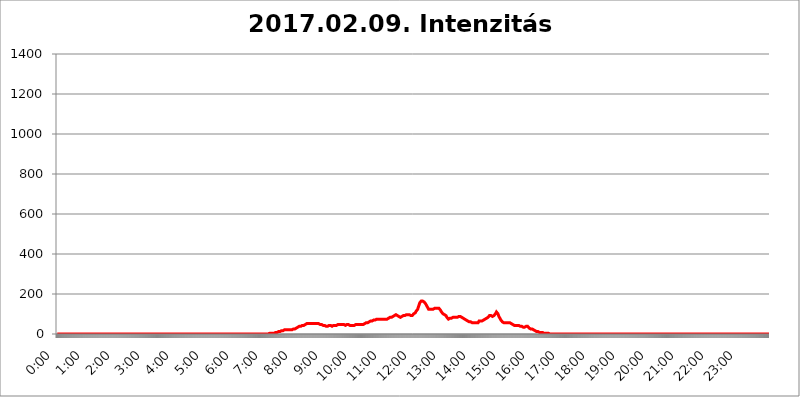
| Category | 2017.02.09. Intenzitás [W/m^2] |
|---|---|
| 0.0 | 0 |
| 0.0006944444444444445 | 0 |
| 0.001388888888888889 | 0 |
| 0.0020833333333333333 | 0 |
| 0.002777777777777778 | 0 |
| 0.003472222222222222 | 0 |
| 0.004166666666666667 | 0 |
| 0.004861111111111111 | 0 |
| 0.005555555555555556 | 0 |
| 0.0062499999999999995 | 0 |
| 0.006944444444444444 | 0 |
| 0.007638888888888889 | 0 |
| 0.008333333333333333 | 0 |
| 0.009027777777777779 | 0 |
| 0.009722222222222222 | 0 |
| 0.010416666666666666 | 0 |
| 0.011111111111111112 | 0 |
| 0.011805555555555555 | 0 |
| 0.012499999999999999 | 0 |
| 0.013194444444444444 | 0 |
| 0.013888888888888888 | 0 |
| 0.014583333333333332 | 0 |
| 0.015277777777777777 | 0 |
| 0.015972222222222224 | 0 |
| 0.016666666666666666 | 0 |
| 0.017361111111111112 | 0 |
| 0.018055555555555557 | 0 |
| 0.01875 | 0 |
| 0.019444444444444445 | 0 |
| 0.02013888888888889 | 0 |
| 0.020833333333333332 | 0 |
| 0.02152777777777778 | 0 |
| 0.022222222222222223 | 0 |
| 0.02291666666666667 | 0 |
| 0.02361111111111111 | 0 |
| 0.024305555555555556 | 0 |
| 0.024999999999999998 | 0 |
| 0.025694444444444447 | 0 |
| 0.02638888888888889 | 0 |
| 0.027083333333333334 | 0 |
| 0.027777777777777776 | 0 |
| 0.02847222222222222 | 0 |
| 0.029166666666666664 | 0 |
| 0.029861111111111113 | 0 |
| 0.030555555555555555 | 0 |
| 0.03125 | 0 |
| 0.03194444444444445 | 0 |
| 0.03263888888888889 | 0 |
| 0.03333333333333333 | 0 |
| 0.034027777777777775 | 0 |
| 0.034722222222222224 | 0 |
| 0.035416666666666666 | 0 |
| 0.036111111111111115 | 0 |
| 0.03680555555555556 | 0 |
| 0.0375 | 0 |
| 0.03819444444444444 | 0 |
| 0.03888888888888889 | 0 |
| 0.03958333333333333 | 0 |
| 0.04027777777777778 | 0 |
| 0.04097222222222222 | 0 |
| 0.041666666666666664 | 0 |
| 0.042361111111111106 | 0 |
| 0.04305555555555556 | 0 |
| 0.043750000000000004 | 0 |
| 0.044444444444444446 | 0 |
| 0.04513888888888889 | 0 |
| 0.04583333333333334 | 0 |
| 0.04652777777777778 | 0 |
| 0.04722222222222222 | 0 |
| 0.04791666666666666 | 0 |
| 0.04861111111111111 | 0 |
| 0.049305555555555554 | 0 |
| 0.049999999999999996 | 0 |
| 0.05069444444444445 | 0 |
| 0.051388888888888894 | 0 |
| 0.052083333333333336 | 0 |
| 0.05277777777777778 | 0 |
| 0.05347222222222222 | 0 |
| 0.05416666666666667 | 0 |
| 0.05486111111111111 | 0 |
| 0.05555555555555555 | 0 |
| 0.05625 | 0 |
| 0.05694444444444444 | 0 |
| 0.057638888888888885 | 0 |
| 0.05833333333333333 | 0 |
| 0.05902777777777778 | 0 |
| 0.059722222222222225 | 0 |
| 0.06041666666666667 | 0 |
| 0.061111111111111116 | 0 |
| 0.06180555555555556 | 0 |
| 0.0625 | 0 |
| 0.06319444444444444 | 0 |
| 0.06388888888888888 | 0 |
| 0.06458333333333334 | 0 |
| 0.06527777777777778 | 0 |
| 0.06597222222222222 | 0 |
| 0.06666666666666667 | 0 |
| 0.06736111111111111 | 0 |
| 0.06805555555555555 | 0 |
| 0.06874999999999999 | 0 |
| 0.06944444444444443 | 0 |
| 0.07013888888888889 | 0 |
| 0.07083333333333333 | 0 |
| 0.07152777777777779 | 0 |
| 0.07222222222222223 | 0 |
| 0.07291666666666667 | 0 |
| 0.07361111111111111 | 0 |
| 0.07430555555555556 | 0 |
| 0.075 | 0 |
| 0.07569444444444444 | 0 |
| 0.0763888888888889 | 0 |
| 0.07708333333333334 | 0 |
| 0.07777777777777778 | 0 |
| 0.07847222222222222 | 0 |
| 0.07916666666666666 | 0 |
| 0.0798611111111111 | 0 |
| 0.08055555555555556 | 0 |
| 0.08125 | 0 |
| 0.08194444444444444 | 0 |
| 0.08263888888888889 | 0 |
| 0.08333333333333333 | 0 |
| 0.08402777777777777 | 0 |
| 0.08472222222222221 | 0 |
| 0.08541666666666665 | 0 |
| 0.08611111111111112 | 0 |
| 0.08680555555555557 | 0 |
| 0.08750000000000001 | 0 |
| 0.08819444444444445 | 0 |
| 0.08888888888888889 | 0 |
| 0.08958333333333333 | 0 |
| 0.09027777777777778 | 0 |
| 0.09097222222222222 | 0 |
| 0.09166666666666667 | 0 |
| 0.09236111111111112 | 0 |
| 0.09305555555555556 | 0 |
| 0.09375 | 0 |
| 0.09444444444444444 | 0 |
| 0.09513888888888888 | 0 |
| 0.09583333333333333 | 0 |
| 0.09652777777777777 | 0 |
| 0.09722222222222222 | 0 |
| 0.09791666666666667 | 0 |
| 0.09861111111111111 | 0 |
| 0.09930555555555555 | 0 |
| 0.09999999999999999 | 0 |
| 0.10069444444444443 | 0 |
| 0.1013888888888889 | 0 |
| 0.10208333333333335 | 0 |
| 0.10277777777777779 | 0 |
| 0.10347222222222223 | 0 |
| 0.10416666666666667 | 0 |
| 0.10486111111111111 | 0 |
| 0.10555555555555556 | 0 |
| 0.10625 | 0 |
| 0.10694444444444444 | 0 |
| 0.1076388888888889 | 0 |
| 0.10833333333333334 | 0 |
| 0.10902777777777778 | 0 |
| 0.10972222222222222 | 0 |
| 0.1111111111111111 | 0 |
| 0.11180555555555556 | 0 |
| 0.11180555555555556 | 0 |
| 0.1125 | 0 |
| 0.11319444444444444 | 0 |
| 0.11388888888888889 | 0 |
| 0.11458333333333333 | 0 |
| 0.11527777777777777 | 0 |
| 0.11597222222222221 | 0 |
| 0.11666666666666665 | 0 |
| 0.1173611111111111 | 0 |
| 0.11805555555555557 | 0 |
| 0.11944444444444445 | 0 |
| 0.12013888888888889 | 0 |
| 0.12083333333333333 | 0 |
| 0.12152777777777778 | 0 |
| 0.12222222222222223 | 0 |
| 0.12291666666666667 | 0 |
| 0.12291666666666667 | 0 |
| 0.12361111111111112 | 0 |
| 0.12430555555555556 | 0 |
| 0.125 | 0 |
| 0.12569444444444444 | 0 |
| 0.12638888888888888 | 0 |
| 0.12708333333333333 | 0 |
| 0.16875 | 0 |
| 0.12847222222222224 | 0 |
| 0.12916666666666668 | 0 |
| 0.12986111111111112 | 0 |
| 0.13055555555555556 | 0 |
| 0.13125 | 0 |
| 0.13194444444444445 | 0 |
| 0.1326388888888889 | 0 |
| 0.13333333333333333 | 0 |
| 0.13402777777777777 | 0 |
| 0.13402777777777777 | 0 |
| 0.13472222222222222 | 0 |
| 0.13541666666666666 | 0 |
| 0.1361111111111111 | 0 |
| 0.13749999999999998 | 0 |
| 0.13819444444444443 | 0 |
| 0.1388888888888889 | 0 |
| 0.13958333333333334 | 0 |
| 0.14027777777777778 | 0 |
| 0.14097222222222222 | 0 |
| 0.14166666666666666 | 0 |
| 0.1423611111111111 | 0 |
| 0.14305555555555557 | 0 |
| 0.14375000000000002 | 0 |
| 0.14444444444444446 | 0 |
| 0.1451388888888889 | 0 |
| 0.1451388888888889 | 0 |
| 0.14652777777777778 | 0 |
| 0.14722222222222223 | 0 |
| 0.14791666666666667 | 0 |
| 0.1486111111111111 | 0 |
| 0.14930555555555555 | 0 |
| 0.15 | 0 |
| 0.15069444444444444 | 0 |
| 0.15138888888888888 | 0 |
| 0.15208333333333332 | 0 |
| 0.15277777777777776 | 0 |
| 0.15347222222222223 | 0 |
| 0.15416666666666667 | 0 |
| 0.15486111111111112 | 0 |
| 0.15555555555555556 | 0 |
| 0.15625 | 0 |
| 0.15694444444444444 | 0 |
| 0.15763888888888888 | 0 |
| 0.15833333333333333 | 0 |
| 0.15902777777777777 | 0 |
| 0.15972222222222224 | 0 |
| 0.16041666666666668 | 0 |
| 0.16111111111111112 | 0 |
| 0.16180555555555556 | 0 |
| 0.1625 | 0 |
| 0.16319444444444445 | 0 |
| 0.1638888888888889 | 0 |
| 0.16458333333333333 | 0 |
| 0.16527777777777777 | 0 |
| 0.16597222222222222 | 0 |
| 0.16666666666666666 | 0 |
| 0.1673611111111111 | 0 |
| 0.16805555555555554 | 0 |
| 0.16874999999999998 | 0 |
| 0.16944444444444443 | 0 |
| 0.17013888888888887 | 0 |
| 0.1708333333333333 | 0 |
| 0.17152777777777775 | 0 |
| 0.17222222222222225 | 0 |
| 0.1729166666666667 | 0 |
| 0.17361111111111113 | 0 |
| 0.17430555555555557 | 0 |
| 0.17500000000000002 | 0 |
| 0.17569444444444446 | 0 |
| 0.1763888888888889 | 0 |
| 0.17708333333333334 | 0 |
| 0.17777777777777778 | 0 |
| 0.17847222222222223 | 0 |
| 0.17916666666666667 | 0 |
| 0.1798611111111111 | 0 |
| 0.18055555555555555 | 0 |
| 0.18125 | 0 |
| 0.18194444444444444 | 0 |
| 0.1826388888888889 | 0 |
| 0.18333333333333335 | 0 |
| 0.1840277777777778 | 0 |
| 0.18472222222222223 | 0 |
| 0.18541666666666667 | 0 |
| 0.18611111111111112 | 0 |
| 0.18680555555555556 | 0 |
| 0.1875 | 0 |
| 0.18819444444444444 | 0 |
| 0.18888888888888888 | 0 |
| 0.18958333333333333 | 0 |
| 0.19027777777777777 | 0 |
| 0.1909722222222222 | 0 |
| 0.19166666666666665 | 0 |
| 0.19236111111111112 | 0 |
| 0.19305555555555554 | 0 |
| 0.19375 | 0 |
| 0.19444444444444445 | 0 |
| 0.1951388888888889 | 0 |
| 0.19583333333333333 | 0 |
| 0.19652777777777777 | 0 |
| 0.19722222222222222 | 0 |
| 0.19791666666666666 | 0 |
| 0.1986111111111111 | 0 |
| 0.19930555555555554 | 0 |
| 0.19999999999999998 | 0 |
| 0.20069444444444443 | 0 |
| 0.20138888888888887 | 0 |
| 0.2020833333333333 | 0 |
| 0.2027777777777778 | 0 |
| 0.2034722222222222 | 0 |
| 0.2041666666666667 | 0 |
| 0.20486111111111113 | 0 |
| 0.20555555555555557 | 0 |
| 0.20625000000000002 | 0 |
| 0.20694444444444446 | 0 |
| 0.2076388888888889 | 0 |
| 0.20833333333333334 | 0 |
| 0.20902777777777778 | 0 |
| 0.20972222222222223 | 0 |
| 0.21041666666666667 | 0 |
| 0.2111111111111111 | 0 |
| 0.21180555555555555 | 0 |
| 0.2125 | 0 |
| 0.21319444444444444 | 0 |
| 0.2138888888888889 | 0 |
| 0.21458333333333335 | 0 |
| 0.2152777777777778 | 0 |
| 0.21597222222222223 | 0 |
| 0.21666666666666667 | 0 |
| 0.21736111111111112 | 0 |
| 0.21805555555555556 | 0 |
| 0.21875 | 0 |
| 0.21944444444444444 | 0 |
| 0.22013888888888888 | 0 |
| 0.22083333333333333 | 0 |
| 0.22152777777777777 | 0 |
| 0.2222222222222222 | 0 |
| 0.22291666666666665 | 0 |
| 0.2236111111111111 | 0 |
| 0.22430555555555556 | 0 |
| 0.225 | 0 |
| 0.22569444444444445 | 0 |
| 0.2263888888888889 | 0 |
| 0.22708333333333333 | 0 |
| 0.22777777777777777 | 0 |
| 0.22847222222222222 | 0 |
| 0.22916666666666666 | 0 |
| 0.2298611111111111 | 0 |
| 0.23055555555555554 | 0 |
| 0.23124999999999998 | 0 |
| 0.23194444444444443 | 0 |
| 0.23263888888888887 | 0 |
| 0.2333333333333333 | 0 |
| 0.2340277777777778 | 0 |
| 0.2347222222222222 | 0 |
| 0.2354166666666667 | 0 |
| 0.23611111111111113 | 0 |
| 0.23680555555555557 | 0 |
| 0.23750000000000002 | 0 |
| 0.23819444444444446 | 0 |
| 0.2388888888888889 | 0 |
| 0.23958333333333334 | 0 |
| 0.24027777777777778 | 0 |
| 0.24097222222222223 | 0 |
| 0.24166666666666667 | 0 |
| 0.2423611111111111 | 0 |
| 0.24305555555555555 | 0 |
| 0.24375 | 0 |
| 0.24444444444444446 | 0 |
| 0.24513888888888888 | 0 |
| 0.24583333333333335 | 0 |
| 0.2465277777777778 | 0 |
| 0.24722222222222223 | 0 |
| 0.24791666666666667 | 0 |
| 0.24861111111111112 | 0 |
| 0.24930555555555556 | 0 |
| 0.25 | 0 |
| 0.25069444444444444 | 0 |
| 0.2513888888888889 | 0 |
| 0.2520833333333333 | 0 |
| 0.25277777777777777 | 0 |
| 0.2534722222222222 | 0 |
| 0.25416666666666665 | 0 |
| 0.2548611111111111 | 0 |
| 0.2555555555555556 | 0 |
| 0.25625000000000003 | 0 |
| 0.2569444444444445 | 0 |
| 0.2576388888888889 | 0 |
| 0.25833333333333336 | 0 |
| 0.2590277777777778 | 0 |
| 0.25972222222222224 | 0 |
| 0.2604166666666667 | 0 |
| 0.2611111111111111 | 0 |
| 0.26180555555555557 | 0 |
| 0.2625 | 0 |
| 0.26319444444444445 | 0 |
| 0.2638888888888889 | 0 |
| 0.26458333333333334 | 0 |
| 0.2652777777777778 | 0 |
| 0.2659722222222222 | 0 |
| 0.26666666666666666 | 0 |
| 0.2673611111111111 | 0 |
| 0.26805555555555555 | 0 |
| 0.26875 | 0 |
| 0.26944444444444443 | 0 |
| 0.2701388888888889 | 0 |
| 0.2708333333333333 | 0 |
| 0.27152777777777776 | 0 |
| 0.2722222222222222 | 0 |
| 0.27291666666666664 | 0 |
| 0.2736111111111111 | 0 |
| 0.2743055555555555 | 0 |
| 0.27499999999999997 | 0 |
| 0.27569444444444446 | 0 |
| 0.27638888888888885 | 0 |
| 0.27708333333333335 | 0 |
| 0.2777777777777778 | 0 |
| 0.27847222222222223 | 0 |
| 0.2791666666666667 | 0 |
| 0.2798611111111111 | 0 |
| 0.28055555555555556 | 0 |
| 0.28125 | 0 |
| 0.28194444444444444 | 0 |
| 0.2826388888888889 | 0 |
| 0.2833333333333333 | 0 |
| 0.28402777777777777 | 0 |
| 0.2847222222222222 | 0 |
| 0.28541666666666665 | 0 |
| 0.28611111111111115 | 0 |
| 0.28680555555555554 | 0 |
| 0.28750000000000003 | 0 |
| 0.2881944444444445 | 0 |
| 0.2888888888888889 | 0 |
| 0.28958333333333336 | 0 |
| 0.2902777777777778 | 0 |
| 0.29097222222222224 | 0 |
| 0.2916666666666667 | 0 |
| 0.2923611111111111 | 0 |
| 0.29305555555555557 | 0 |
| 0.29375 | 0 |
| 0.29444444444444445 | 0 |
| 0.2951388888888889 | 0 |
| 0.29583333333333334 | 0 |
| 0.2965277777777778 | 0 |
| 0.2972222222222222 | 3.525 |
| 0.29791666666666666 | 3.525 |
| 0.2986111111111111 | 3.525 |
| 0.29930555555555555 | 3.525 |
| 0.3 | 3.525 |
| 0.30069444444444443 | 3.525 |
| 0.3013888888888889 | 3.525 |
| 0.3020833333333333 | 3.525 |
| 0.30277777777777776 | 3.525 |
| 0.3034722222222222 | 3.525 |
| 0.30416666666666664 | 3.525 |
| 0.3048611111111111 | 3.525 |
| 0.3055555555555555 | 3.525 |
| 0.30624999999999997 | 7.887 |
| 0.3069444444444444 | 7.887 |
| 0.3076388888888889 | 7.887 |
| 0.30833333333333335 | 7.887 |
| 0.3090277777777778 | 12.257 |
| 0.30972222222222223 | 12.257 |
| 0.3104166666666667 | 12.257 |
| 0.3111111111111111 | 12.257 |
| 0.31180555555555556 | 12.257 |
| 0.3125 | 12.257 |
| 0.31319444444444444 | 16.636 |
| 0.3138888888888889 | 16.636 |
| 0.3145833333333333 | 16.636 |
| 0.31527777777777777 | 16.636 |
| 0.3159722222222222 | 16.636 |
| 0.31666666666666665 | 16.636 |
| 0.31736111111111115 | 21.024 |
| 0.31805555555555554 | 21.024 |
| 0.31875000000000003 | 21.024 |
| 0.3194444444444445 | 21.024 |
| 0.3201388888888889 | 21.024 |
| 0.32083333333333336 | 21.024 |
| 0.3215277777777778 | 21.024 |
| 0.32222222222222224 | 21.024 |
| 0.3229166666666667 | 21.024 |
| 0.3236111111111111 | 21.024 |
| 0.32430555555555557 | 21.024 |
| 0.325 | 21.024 |
| 0.32569444444444445 | 21.024 |
| 0.3263888888888889 | 21.024 |
| 0.32708333333333334 | 21.024 |
| 0.3277777777777778 | 21.024 |
| 0.3284722222222222 | 21.024 |
| 0.32916666666666666 | 21.024 |
| 0.3298611111111111 | 21.024 |
| 0.33055555555555555 | 21.024 |
| 0.33125 | 25.419 |
| 0.33194444444444443 | 25.419 |
| 0.3326388888888889 | 25.419 |
| 0.3333333333333333 | 25.419 |
| 0.3340277777777778 | 25.419 |
| 0.3347222222222222 | 29.823 |
| 0.3354166666666667 | 29.823 |
| 0.3361111111111111 | 29.823 |
| 0.3368055555555556 | 29.823 |
| 0.33749999999999997 | 34.234 |
| 0.33819444444444446 | 34.234 |
| 0.33888888888888885 | 38.653 |
| 0.33958333333333335 | 38.653 |
| 0.34027777777777773 | 38.653 |
| 0.34097222222222223 | 43.079 |
| 0.3416666666666666 | 38.653 |
| 0.3423611111111111 | 43.079 |
| 0.3430555555555555 | 43.079 |
| 0.34375 | 43.079 |
| 0.3444444444444445 | 43.079 |
| 0.3451388888888889 | 43.079 |
| 0.3458333333333334 | 43.079 |
| 0.34652777777777777 | 43.079 |
| 0.34722222222222227 | 47.511 |
| 0.34791666666666665 | 47.511 |
| 0.34861111111111115 | 47.511 |
| 0.34930555555555554 | 51.951 |
| 0.35000000000000003 | 51.951 |
| 0.3506944444444444 | 51.951 |
| 0.3513888888888889 | 51.951 |
| 0.3520833333333333 | 51.951 |
| 0.3527777777777778 | 51.951 |
| 0.3534722222222222 | 51.951 |
| 0.3541666666666667 | 51.951 |
| 0.3548611111111111 | 51.951 |
| 0.35555555555555557 | 51.951 |
| 0.35625 | 51.951 |
| 0.35694444444444445 | 51.951 |
| 0.3576388888888889 | 51.951 |
| 0.35833333333333334 | 51.951 |
| 0.3590277777777778 | 51.951 |
| 0.3597222222222222 | 51.951 |
| 0.36041666666666666 | 51.951 |
| 0.3611111111111111 | 51.951 |
| 0.36180555555555555 | 51.951 |
| 0.3625 | 51.951 |
| 0.36319444444444443 | 51.951 |
| 0.3638888888888889 | 51.951 |
| 0.3645833333333333 | 51.951 |
| 0.3652777777777778 | 56.398 |
| 0.3659722222222222 | 56.398 |
| 0.3666666666666667 | 51.951 |
| 0.3673611111111111 | 51.951 |
| 0.3680555555555556 | 51.951 |
| 0.36874999999999997 | 47.511 |
| 0.36944444444444446 | 47.511 |
| 0.37013888888888885 | 47.511 |
| 0.37083333333333335 | 47.511 |
| 0.37152777777777773 | 43.079 |
| 0.37222222222222223 | 43.079 |
| 0.3729166666666666 | 43.079 |
| 0.3736111111111111 | 43.079 |
| 0.3743055555555555 | 43.079 |
| 0.375 | 43.079 |
| 0.3756944444444445 | 43.079 |
| 0.3763888888888889 | 38.653 |
| 0.3770833333333334 | 38.653 |
| 0.37777777777777777 | 38.653 |
| 0.37847222222222227 | 38.653 |
| 0.37916666666666665 | 38.653 |
| 0.37986111111111115 | 38.653 |
| 0.38055555555555554 | 43.079 |
| 0.38125000000000003 | 43.079 |
| 0.3819444444444444 | 43.079 |
| 0.3826388888888889 | 43.079 |
| 0.3833333333333333 | 43.079 |
| 0.3840277777777778 | 38.653 |
| 0.3847222222222222 | 38.653 |
| 0.3854166666666667 | 38.653 |
| 0.3861111111111111 | 38.653 |
| 0.38680555555555557 | 38.653 |
| 0.3875 | 43.079 |
| 0.38819444444444445 | 43.079 |
| 0.3888888888888889 | 43.079 |
| 0.38958333333333334 | 43.079 |
| 0.3902777777777778 | 43.079 |
| 0.3909722222222222 | 43.079 |
| 0.39166666666666666 | 43.079 |
| 0.3923611111111111 | 47.511 |
| 0.39305555555555555 | 47.511 |
| 0.39375 | 47.511 |
| 0.39444444444444443 | 47.511 |
| 0.3951388888888889 | 47.511 |
| 0.3958333333333333 | 47.511 |
| 0.3965277777777778 | 47.511 |
| 0.3972222222222222 | 47.511 |
| 0.3979166666666667 | 47.511 |
| 0.3986111111111111 | 47.511 |
| 0.3993055555555556 | 47.511 |
| 0.39999999999999997 | 47.511 |
| 0.40069444444444446 | 47.511 |
| 0.40138888888888885 | 47.511 |
| 0.40208333333333335 | 47.511 |
| 0.40277777777777773 | 47.511 |
| 0.40347222222222223 | 43.079 |
| 0.4041666666666666 | 43.079 |
| 0.4048611111111111 | 43.079 |
| 0.4055555555555555 | 43.079 |
| 0.40625 | 47.511 |
| 0.4069444444444445 | 47.511 |
| 0.4076388888888889 | 47.511 |
| 0.4083333333333334 | 47.511 |
| 0.40902777777777777 | 43.079 |
| 0.40972222222222227 | 43.079 |
| 0.41041666666666665 | 43.079 |
| 0.41111111111111115 | 43.079 |
| 0.41180555555555554 | 43.079 |
| 0.41250000000000003 | 43.079 |
| 0.4131944444444444 | 43.079 |
| 0.4138888888888889 | 43.079 |
| 0.4145833333333333 | 43.079 |
| 0.4152777777777778 | 43.079 |
| 0.4159722222222222 | 43.079 |
| 0.4166666666666667 | 43.079 |
| 0.4173611111111111 | 43.079 |
| 0.41805555555555557 | 43.079 |
| 0.41875 | 47.511 |
| 0.41944444444444445 | 47.511 |
| 0.4201388888888889 | 47.511 |
| 0.42083333333333334 | 47.511 |
| 0.4215277777777778 | 47.511 |
| 0.4222222222222222 | 47.511 |
| 0.42291666666666666 | 47.511 |
| 0.4236111111111111 | 47.511 |
| 0.42430555555555555 | 47.511 |
| 0.425 | 47.511 |
| 0.42569444444444443 | 47.511 |
| 0.4263888888888889 | 47.511 |
| 0.4270833333333333 | 47.511 |
| 0.4277777777777778 | 47.511 |
| 0.4284722222222222 | 47.511 |
| 0.4291666666666667 | 47.511 |
| 0.4298611111111111 | 47.511 |
| 0.4305555555555556 | 51.951 |
| 0.43124999999999997 | 51.951 |
| 0.43194444444444446 | 51.951 |
| 0.43263888888888885 | 51.951 |
| 0.43333333333333335 | 56.398 |
| 0.43402777777777773 | 56.398 |
| 0.43472222222222223 | 56.398 |
| 0.4354166666666666 | 56.398 |
| 0.4361111111111111 | 60.85 |
| 0.4368055555555555 | 60.85 |
| 0.4375 | 60.85 |
| 0.4381944444444445 | 65.31 |
| 0.4388888888888889 | 65.31 |
| 0.4395833333333334 | 65.31 |
| 0.44027777777777777 | 65.31 |
| 0.44097222222222227 | 65.31 |
| 0.44166666666666665 | 65.31 |
| 0.44236111111111115 | 65.31 |
| 0.44305555555555554 | 69.775 |
| 0.44375000000000003 | 69.775 |
| 0.4444444444444444 | 69.775 |
| 0.4451388888888889 | 69.775 |
| 0.4458333333333333 | 69.775 |
| 0.4465277777777778 | 69.775 |
| 0.4472222222222222 | 74.246 |
| 0.4479166666666667 | 74.246 |
| 0.4486111111111111 | 74.246 |
| 0.44930555555555557 | 74.246 |
| 0.45 | 74.246 |
| 0.45069444444444445 | 74.246 |
| 0.4513888888888889 | 74.246 |
| 0.45208333333333334 | 74.246 |
| 0.4527777777777778 | 74.246 |
| 0.4534722222222222 | 74.246 |
| 0.45416666666666666 | 74.246 |
| 0.4548611111111111 | 74.246 |
| 0.45555555555555555 | 74.246 |
| 0.45625 | 74.246 |
| 0.45694444444444443 | 74.246 |
| 0.4576388888888889 | 74.246 |
| 0.4583333333333333 | 74.246 |
| 0.4590277777777778 | 74.246 |
| 0.4597222222222222 | 74.246 |
| 0.4604166666666667 | 74.246 |
| 0.4611111111111111 | 74.246 |
| 0.4618055555555556 | 74.246 |
| 0.46249999999999997 | 74.246 |
| 0.46319444444444446 | 74.246 |
| 0.46388888888888885 | 78.722 |
| 0.46458333333333335 | 78.722 |
| 0.46527777777777773 | 83.205 |
| 0.46597222222222223 | 83.205 |
| 0.4666666666666666 | 83.205 |
| 0.4673611111111111 | 83.205 |
| 0.4680555555555555 | 83.205 |
| 0.46875 | 83.205 |
| 0.4694444444444445 | 87.692 |
| 0.4701388888888889 | 87.692 |
| 0.4708333333333334 | 87.692 |
| 0.47152777777777777 | 92.184 |
| 0.47222222222222227 | 92.184 |
| 0.47291666666666665 | 92.184 |
| 0.47361111111111115 | 92.184 |
| 0.47430555555555554 | 96.682 |
| 0.47500000000000003 | 96.682 |
| 0.4756944444444444 | 96.682 |
| 0.4763888888888889 | 92.184 |
| 0.4770833333333333 | 92.184 |
| 0.4777777777777778 | 87.692 |
| 0.4784722222222222 | 87.692 |
| 0.4791666666666667 | 87.692 |
| 0.4798611111111111 | 87.692 |
| 0.48055555555555557 | 83.205 |
| 0.48125 | 83.205 |
| 0.48194444444444445 | 87.692 |
| 0.4826388888888889 | 87.692 |
| 0.48333333333333334 | 87.692 |
| 0.4840277777777778 | 92.184 |
| 0.4847222222222222 | 87.692 |
| 0.48541666666666666 | 92.184 |
| 0.4861111111111111 | 92.184 |
| 0.48680555555555555 | 92.184 |
| 0.4875 | 92.184 |
| 0.48819444444444443 | 92.184 |
| 0.4888888888888889 | 96.682 |
| 0.4895833333333333 | 96.682 |
| 0.4902777777777778 | 96.682 |
| 0.4909722222222222 | 96.682 |
| 0.4916666666666667 | 96.682 |
| 0.4923611111111111 | 96.682 |
| 0.4930555555555556 | 96.682 |
| 0.49374999999999997 | 96.682 |
| 0.49444444444444446 | 92.184 |
| 0.49513888888888885 | 92.184 |
| 0.49583333333333335 | 92.184 |
| 0.49652777777777773 | 92.184 |
| 0.49722222222222223 | 92.184 |
| 0.4979166666666666 | 92.184 |
| 0.4986111111111111 | 96.682 |
| 0.4993055555555555 | 96.682 |
| 0.5 | 101.184 |
| 0.5006944444444444 | 101.184 |
| 0.5013888888888889 | 101.184 |
| 0.5020833333333333 | 105.69 |
| 0.5027777777777778 | 110.201 |
| 0.5034722222222222 | 114.716 |
| 0.5041666666666667 | 114.716 |
| 0.5048611111111111 | 119.235 |
| 0.5055555555555555 | 123.758 |
| 0.50625 | 132.814 |
| 0.5069444444444444 | 137.347 |
| 0.5076388888888889 | 146.423 |
| 0.5083333333333333 | 155.509 |
| 0.5090277777777777 | 160.056 |
| 0.5097222222222222 | 160.056 |
| 0.5104166666666666 | 164.605 |
| 0.5111111111111112 | 164.605 |
| 0.5118055555555555 | 164.605 |
| 0.5125000000000001 | 164.605 |
| 0.5131944444444444 | 164.605 |
| 0.513888888888889 | 164.605 |
| 0.5145833333333333 | 160.056 |
| 0.5152777777777778 | 155.509 |
| 0.5159722222222222 | 155.509 |
| 0.5166666666666667 | 150.964 |
| 0.517361111111111 | 146.423 |
| 0.5180555555555556 | 141.884 |
| 0.5187499999999999 | 137.347 |
| 0.5194444444444445 | 132.814 |
| 0.5201388888888888 | 128.284 |
| 0.5208333333333334 | 123.758 |
| 0.5215277777777778 | 123.758 |
| 0.5222222222222223 | 123.758 |
| 0.5229166666666667 | 123.758 |
| 0.5236111111111111 | 123.758 |
| 0.5243055555555556 | 123.758 |
| 0.525 | 123.758 |
| 0.5256944444444445 | 123.758 |
| 0.5263888888888889 | 123.758 |
| 0.5270833333333333 | 123.758 |
| 0.5277777777777778 | 123.758 |
| 0.5284722222222222 | 123.758 |
| 0.5291666666666667 | 128.284 |
| 0.5298611111111111 | 128.284 |
| 0.5305555555555556 | 128.284 |
| 0.53125 | 128.284 |
| 0.5319444444444444 | 128.284 |
| 0.5326388888888889 | 123.758 |
| 0.5333333333333333 | 128.284 |
| 0.5340277777777778 | 128.284 |
| 0.5347222222222222 | 128.284 |
| 0.5354166666666667 | 128.284 |
| 0.5361111111111111 | 128.284 |
| 0.5368055555555555 | 123.758 |
| 0.5375 | 119.235 |
| 0.5381944444444444 | 119.235 |
| 0.5388888888888889 | 110.201 |
| 0.5395833333333333 | 110.201 |
| 0.5402777777777777 | 105.69 |
| 0.5409722222222222 | 101.184 |
| 0.5416666666666666 | 101.184 |
| 0.5423611111111112 | 96.682 |
| 0.5430555555555555 | 96.682 |
| 0.5437500000000001 | 92.184 |
| 0.5444444444444444 | 92.184 |
| 0.545138888888889 | 92.184 |
| 0.5458333333333333 | 87.692 |
| 0.5465277777777778 | 83.205 |
| 0.5472222222222222 | 83.205 |
| 0.5479166666666667 | 78.722 |
| 0.548611111111111 | 74.246 |
| 0.5493055555555556 | 74.246 |
| 0.5499999999999999 | 74.246 |
| 0.5506944444444445 | 78.722 |
| 0.5513888888888888 | 78.722 |
| 0.5520833333333334 | 78.722 |
| 0.5527777777777778 | 78.722 |
| 0.5534722222222223 | 78.722 |
| 0.5541666666666667 | 83.205 |
| 0.5548611111111111 | 83.205 |
| 0.5555555555555556 | 83.205 |
| 0.55625 | 83.205 |
| 0.5569444444444445 | 83.205 |
| 0.5576388888888889 | 83.205 |
| 0.5583333333333333 | 83.205 |
| 0.5590277777777778 | 83.205 |
| 0.5597222222222222 | 83.205 |
| 0.5604166666666667 | 83.205 |
| 0.5611111111111111 | 83.205 |
| 0.5618055555555556 | 83.205 |
| 0.5625 | 87.692 |
| 0.5631944444444444 | 87.692 |
| 0.5638888888888889 | 87.692 |
| 0.5645833333333333 | 87.692 |
| 0.5652777777777778 | 87.692 |
| 0.5659722222222222 | 87.692 |
| 0.5666666666666667 | 87.692 |
| 0.5673611111111111 | 83.205 |
| 0.5680555555555555 | 83.205 |
| 0.56875 | 83.205 |
| 0.5694444444444444 | 78.722 |
| 0.5701388888888889 | 74.246 |
| 0.5708333333333333 | 74.246 |
| 0.5715277777777777 | 74.246 |
| 0.5722222222222222 | 74.246 |
| 0.5729166666666666 | 69.775 |
| 0.5736111111111112 | 69.775 |
| 0.5743055555555555 | 65.31 |
| 0.5750000000000001 | 65.31 |
| 0.5756944444444444 | 65.31 |
| 0.576388888888889 | 65.31 |
| 0.5770833333333333 | 60.85 |
| 0.5777777777777778 | 60.85 |
| 0.5784722222222222 | 60.85 |
| 0.5791666666666667 | 60.85 |
| 0.579861111111111 | 60.85 |
| 0.5805555555555556 | 60.85 |
| 0.5812499999999999 | 60.85 |
| 0.5819444444444445 | 56.398 |
| 0.5826388888888888 | 56.398 |
| 0.5833333333333334 | 56.398 |
| 0.5840277777777778 | 56.398 |
| 0.5847222222222223 | 56.398 |
| 0.5854166666666667 | 56.398 |
| 0.5861111111111111 | 56.398 |
| 0.5868055555555556 | 56.398 |
| 0.5875 | 56.398 |
| 0.5881944444444445 | 56.398 |
| 0.5888888888888889 | 56.398 |
| 0.5895833333333333 | 56.398 |
| 0.5902777777777778 | 56.398 |
| 0.5909722222222222 | 60.85 |
| 0.5916666666666667 | 65.31 |
| 0.5923611111111111 | 65.31 |
| 0.5930555555555556 | 65.31 |
| 0.59375 | 65.31 |
| 0.5944444444444444 | 65.31 |
| 0.5951388888888889 | 65.31 |
| 0.5958333333333333 | 65.31 |
| 0.5965277777777778 | 65.31 |
| 0.5972222222222222 | 65.31 |
| 0.5979166666666667 | 69.775 |
| 0.5986111111111111 | 69.775 |
| 0.5993055555555555 | 74.246 |
| 0.6 | 74.246 |
| 0.6006944444444444 | 74.246 |
| 0.6013888888888889 | 78.722 |
| 0.6020833333333333 | 78.722 |
| 0.6027777777777777 | 78.722 |
| 0.6034722222222222 | 78.722 |
| 0.6041666666666666 | 83.205 |
| 0.6048611111111112 | 83.205 |
| 0.6055555555555555 | 87.692 |
| 0.6062500000000001 | 92.184 |
| 0.6069444444444444 | 92.184 |
| 0.607638888888889 | 92.184 |
| 0.6083333333333333 | 92.184 |
| 0.6090277777777778 | 87.692 |
| 0.6097222222222222 | 87.692 |
| 0.6104166666666667 | 87.692 |
| 0.611111111111111 | 87.692 |
| 0.6118055555555556 | 87.692 |
| 0.6124999999999999 | 92.184 |
| 0.6131944444444445 | 92.184 |
| 0.6138888888888888 | 96.682 |
| 0.6145833333333334 | 101.184 |
| 0.6152777777777778 | 105.69 |
| 0.6159722222222223 | 110.201 |
| 0.6166666666666667 | 110.201 |
| 0.6173611111111111 | 110.201 |
| 0.6180555555555556 | 101.184 |
| 0.61875 | 96.682 |
| 0.6194444444444445 | 87.692 |
| 0.6201388888888889 | 83.205 |
| 0.6208333333333333 | 78.722 |
| 0.6215277777777778 | 74.246 |
| 0.6222222222222222 | 69.775 |
| 0.6229166666666667 | 65.31 |
| 0.6236111111111111 | 65.31 |
| 0.6243055555555556 | 60.85 |
| 0.625 | 56.398 |
| 0.6256944444444444 | 56.398 |
| 0.6263888888888889 | 56.398 |
| 0.6270833333333333 | 51.951 |
| 0.6277777777777778 | 56.398 |
| 0.6284722222222222 | 56.398 |
| 0.6291666666666667 | 56.398 |
| 0.6298611111111111 | 56.398 |
| 0.6305555555555555 | 56.398 |
| 0.63125 | 56.398 |
| 0.6319444444444444 | 56.398 |
| 0.6326388888888889 | 56.398 |
| 0.6333333333333333 | 56.398 |
| 0.6340277777777777 | 56.398 |
| 0.6347222222222222 | 56.398 |
| 0.6354166666666666 | 56.398 |
| 0.6361111111111112 | 56.398 |
| 0.6368055555555555 | 51.951 |
| 0.6375000000000001 | 51.951 |
| 0.6381944444444444 | 47.511 |
| 0.638888888888889 | 47.511 |
| 0.6395833333333333 | 43.079 |
| 0.6402777777777778 | 43.079 |
| 0.6409722222222222 | 43.079 |
| 0.6416666666666667 | 43.079 |
| 0.642361111111111 | 43.079 |
| 0.6430555555555556 | 43.079 |
| 0.6437499999999999 | 43.079 |
| 0.6444444444444445 | 43.079 |
| 0.6451388888888888 | 43.079 |
| 0.6458333333333334 | 43.079 |
| 0.6465277777777778 | 43.079 |
| 0.6472222222222223 | 43.079 |
| 0.6479166666666667 | 43.079 |
| 0.6486111111111111 | 43.079 |
| 0.6493055555555556 | 38.653 |
| 0.65 | 38.653 |
| 0.6506944444444445 | 38.653 |
| 0.6513888888888889 | 38.653 |
| 0.6520833333333333 | 38.653 |
| 0.6527777777777778 | 34.234 |
| 0.6534722222222222 | 34.234 |
| 0.6541666666666667 | 34.234 |
| 0.6548611111111111 | 34.234 |
| 0.6555555555555556 | 34.234 |
| 0.65625 | 34.234 |
| 0.6569444444444444 | 38.653 |
| 0.6576388888888889 | 38.653 |
| 0.6583333333333333 | 38.653 |
| 0.6590277777777778 | 34.234 |
| 0.6597222222222222 | 38.653 |
| 0.6604166666666667 | 34.234 |
| 0.6611111111111111 | 34.234 |
| 0.6618055555555555 | 29.823 |
| 0.6625 | 29.823 |
| 0.6631944444444444 | 29.823 |
| 0.6638888888888889 | 25.419 |
| 0.6645833333333333 | 25.419 |
| 0.6652777777777777 | 25.419 |
| 0.6659722222222222 | 25.419 |
| 0.6666666666666666 | 21.024 |
| 0.6673611111111111 | 21.024 |
| 0.6680555555555556 | 21.024 |
| 0.6687500000000001 | 21.024 |
| 0.6694444444444444 | 16.636 |
| 0.6701388888888888 | 16.636 |
| 0.6708333333333334 | 16.636 |
| 0.6715277777777778 | 16.636 |
| 0.6722222222222222 | 12.257 |
| 0.6729166666666666 | 12.257 |
| 0.6736111111111112 | 12.257 |
| 0.6743055555555556 | 12.257 |
| 0.6749999999999999 | 12.257 |
| 0.6756944444444444 | 7.887 |
| 0.6763888888888889 | 7.887 |
| 0.6770833333333334 | 7.887 |
| 0.6777777777777777 | 7.887 |
| 0.6784722222222223 | 7.887 |
| 0.6791666666666667 | 7.887 |
| 0.6798611111111111 | 7.887 |
| 0.6805555555555555 | 7.887 |
| 0.68125 | 3.525 |
| 0.6819444444444445 | 3.525 |
| 0.6826388888888889 | 3.525 |
| 0.6833333333333332 | 3.525 |
| 0.6840277777777778 | 3.525 |
| 0.6847222222222222 | 3.525 |
| 0.6854166666666667 | 3.525 |
| 0.686111111111111 | 3.525 |
| 0.6868055555555556 | 3.525 |
| 0.6875 | 3.525 |
| 0.6881944444444444 | 3.525 |
| 0.688888888888889 | 3.525 |
| 0.6895833333333333 | 3.525 |
| 0.6902777777777778 | 3.525 |
| 0.6909722222222222 | 0 |
| 0.6916666666666668 | 0 |
| 0.6923611111111111 | 0 |
| 0.6930555555555555 | 0 |
| 0.69375 | 3.525 |
| 0.6944444444444445 | 3.525 |
| 0.6951388888888889 | 0 |
| 0.6958333333333333 | 0 |
| 0.6965277777777777 | 0 |
| 0.6972222222222223 | 0 |
| 0.6979166666666666 | 0 |
| 0.6986111111111111 | 0 |
| 0.6993055555555556 | 0 |
| 0.7000000000000001 | 0 |
| 0.7006944444444444 | 0 |
| 0.7013888888888888 | 0 |
| 0.7020833333333334 | 0 |
| 0.7027777777777778 | 0 |
| 0.7034722222222222 | 0 |
| 0.7041666666666666 | 0 |
| 0.7048611111111112 | 0 |
| 0.7055555555555556 | 0 |
| 0.7062499999999999 | 0 |
| 0.7069444444444444 | 0 |
| 0.7076388888888889 | 0 |
| 0.7083333333333334 | 0 |
| 0.7090277777777777 | 0 |
| 0.7097222222222223 | 0 |
| 0.7104166666666667 | 0 |
| 0.7111111111111111 | 0 |
| 0.7118055555555555 | 0 |
| 0.7125 | 0 |
| 0.7131944444444445 | 0 |
| 0.7138888888888889 | 0 |
| 0.7145833333333332 | 0 |
| 0.7152777777777778 | 0 |
| 0.7159722222222222 | 0 |
| 0.7166666666666667 | 0 |
| 0.717361111111111 | 0 |
| 0.7180555555555556 | 0 |
| 0.71875 | 0 |
| 0.7194444444444444 | 0 |
| 0.720138888888889 | 0 |
| 0.7208333333333333 | 0 |
| 0.7215277777777778 | 0 |
| 0.7222222222222222 | 0 |
| 0.7229166666666668 | 0 |
| 0.7236111111111111 | 0 |
| 0.7243055555555555 | 0 |
| 0.725 | 0 |
| 0.7256944444444445 | 0 |
| 0.7263888888888889 | 0 |
| 0.7270833333333333 | 0 |
| 0.7277777777777777 | 0 |
| 0.7284722222222223 | 0 |
| 0.7291666666666666 | 0 |
| 0.7298611111111111 | 0 |
| 0.7305555555555556 | 0 |
| 0.7312500000000001 | 0 |
| 0.7319444444444444 | 0 |
| 0.7326388888888888 | 0 |
| 0.7333333333333334 | 0 |
| 0.7340277777777778 | 0 |
| 0.7347222222222222 | 0 |
| 0.7354166666666666 | 0 |
| 0.7361111111111112 | 0 |
| 0.7368055555555556 | 0 |
| 0.7374999999999999 | 0 |
| 0.7381944444444444 | 0 |
| 0.7388888888888889 | 0 |
| 0.7395833333333334 | 0 |
| 0.7402777777777777 | 0 |
| 0.7409722222222223 | 0 |
| 0.7416666666666667 | 0 |
| 0.7423611111111111 | 0 |
| 0.7430555555555555 | 0 |
| 0.74375 | 0 |
| 0.7444444444444445 | 0 |
| 0.7451388888888889 | 0 |
| 0.7458333333333332 | 0 |
| 0.7465277777777778 | 0 |
| 0.7472222222222222 | 0 |
| 0.7479166666666667 | 0 |
| 0.748611111111111 | 0 |
| 0.7493055555555556 | 0 |
| 0.75 | 0 |
| 0.7506944444444444 | 0 |
| 0.751388888888889 | 0 |
| 0.7520833333333333 | 0 |
| 0.7527777777777778 | 0 |
| 0.7534722222222222 | 0 |
| 0.7541666666666668 | 0 |
| 0.7548611111111111 | 0 |
| 0.7555555555555555 | 0 |
| 0.75625 | 0 |
| 0.7569444444444445 | 0 |
| 0.7576388888888889 | 0 |
| 0.7583333333333333 | 0 |
| 0.7590277777777777 | 0 |
| 0.7597222222222223 | 0 |
| 0.7604166666666666 | 0 |
| 0.7611111111111111 | 0 |
| 0.7618055555555556 | 0 |
| 0.7625000000000001 | 0 |
| 0.7631944444444444 | 0 |
| 0.7638888888888888 | 0 |
| 0.7645833333333334 | 0 |
| 0.7652777777777778 | 0 |
| 0.7659722222222222 | 0 |
| 0.7666666666666666 | 0 |
| 0.7673611111111112 | 0 |
| 0.7680555555555556 | 0 |
| 0.7687499999999999 | 0 |
| 0.7694444444444444 | 0 |
| 0.7701388888888889 | 0 |
| 0.7708333333333334 | 0 |
| 0.7715277777777777 | 0 |
| 0.7722222222222223 | 0 |
| 0.7729166666666667 | 0 |
| 0.7736111111111111 | 0 |
| 0.7743055555555555 | 0 |
| 0.775 | 0 |
| 0.7756944444444445 | 0 |
| 0.7763888888888889 | 0 |
| 0.7770833333333332 | 0 |
| 0.7777777777777778 | 0 |
| 0.7784722222222222 | 0 |
| 0.7791666666666667 | 0 |
| 0.779861111111111 | 0 |
| 0.7805555555555556 | 0 |
| 0.78125 | 0 |
| 0.7819444444444444 | 0 |
| 0.782638888888889 | 0 |
| 0.7833333333333333 | 0 |
| 0.7840277777777778 | 0 |
| 0.7847222222222222 | 0 |
| 0.7854166666666668 | 0 |
| 0.7861111111111111 | 0 |
| 0.7868055555555555 | 0 |
| 0.7875 | 0 |
| 0.7881944444444445 | 0 |
| 0.7888888888888889 | 0 |
| 0.7895833333333333 | 0 |
| 0.7902777777777777 | 0 |
| 0.7909722222222223 | 0 |
| 0.7916666666666666 | 0 |
| 0.7923611111111111 | 0 |
| 0.7930555555555556 | 0 |
| 0.7937500000000001 | 0 |
| 0.7944444444444444 | 0 |
| 0.7951388888888888 | 0 |
| 0.7958333333333334 | 0 |
| 0.7965277777777778 | 0 |
| 0.7972222222222222 | 0 |
| 0.7979166666666666 | 0 |
| 0.7986111111111112 | 0 |
| 0.7993055555555556 | 0 |
| 0.7999999999999999 | 0 |
| 0.8006944444444444 | 0 |
| 0.8013888888888889 | 0 |
| 0.8020833333333334 | 0 |
| 0.8027777777777777 | 0 |
| 0.8034722222222223 | 0 |
| 0.8041666666666667 | 0 |
| 0.8048611111111111 | 0 |
| 0.8055555555555555 | 0 |
| 0.80625 | 0 |
| 0.8069444444444445 | 0 |
| 0.8076388888888889 | 0 |
| 0.8083333333333332 | 0 |
| 0.8090277777777778 | 0 |
| 0.8097222222222222 | 0 |
| 0.8104166666666667 | 0 |
| 0.811111111111111 | 0 |
| 0.8118055555555556 | 0 |
| 0.8125 | 0 |
| 0.8131944444444444 | 0 |
| 0.813888888888889 | 0 |
| 0.8145833333333333 | 0 |
| 0.8152777777777778 | 0 |
| 0.8159722222222222 | 0 |
| 0.8166666666666668 | 0 |
| 0.8173611111111111 | 0 |
| 0.8180555555555555 | 0 |
| 0.81875 | 0 |
| 0.8194444444444445 | 0 |
| 0.8201388888888889 | 0 |
| 0.8208333333333333 | 0 |
| 0.8215277777777777 | 0 |
| 0.8222222222222223 | 0 |
| 0.8229166666666666 | 0 |
| 0.8236111111111111 | 0 |
| 0.8243055555555556 | 0 |
| 0.8250000000000001 | 0 |
| 0.8256944444444444 | 0 |
| 0.8263888888888888 | 0 |
| 0.8270833333333334 | 0 |
| 0.8277777777777778 | 0 |
| 0.8284722222222222 | 0 |
| 0.8291666666666666 | 0 |
| 0.8298611111111112 | 0 |
| 0.8305555555555556 | 0 |
| 0.8312499999999999 | 0 |
| 0.8319444444444444 | 0 |
| 0.8326388888888889 | 0 |
| 0.8333333333333334 | 0 |
| 0.8340277777777777 | 0 |
| 0.8347222222222223 | 0 |
| 0.8354166666666667 | 0 |
| 0.8361111111111111 | 0 |
| 0.8368055555555555 | 0 |
| 0.8375 | 0 |
| 0.8381944444444445 | 0 |
| 0.8388888888888889 | 0 |
| 0.8395833333333332 | 0 |
| 0.8402777777777778 | 0 |
| 0.8409722222222222 | 0 |
| 0.8416666666666667 | 0 |
| 0.842361111111111 | 0 |
| 0.8430555555555556 | 0 |
| 0.84375 | 0 |
| 0.8444444444444444 | 0 |
| 0.845138888888889 | 0 |
| 0.8458333333333333 | 0 |
| 0.8465277777777778 | 0 |
| 0.8472222222222222 | 0 |
| 0.8479166666666668 | 0 |
| 0.8486111111111111 | 0 |
| 0.8493055555555555 | 0 |
| 0.85 | 0 |
| 0.8506944444444445 | 0 |
| 0.8513888888888889 | 0 |
| 0.8520833333333333 | 0 |
| 0.8527777777777777 | 0 |
| 0.8534722222222223 | 0 |
| 0.8541666666666666 | 0 |
| 0.8548611111111111 | 0 |
| 0.8555555555555556 | 0 |
| 0.8562500000000001 | 0 |
| 0.8569444444444444 | 0 |
| 0.8576388888888888 | 0 |
| 0.8583333333333334 | 0 |
| 0.8590277777777778 | 0 |
| 0.8597222222222222 | 0 |
| 0.8604166666666666 | 0 |
| 0.8611111111111112 | 0 |
| 0.8618055555555556 | 0 |
| 0.8624999999999999 | 0 |
| 0.8631944444444444 | 0 |
| 0.8638888888888889 | 0 |
| 0.8645833333333334 | 0 |
| 0.8652777777777777 | 0 |
| 0.8659722222222223 | 0 |
| 0.8666666666666667 | 0 |
| 0.8673611111111111 | 0 |
| 0.8680555555555555 | 0 |
| 0.86875 | 0 |
| 0.8694444444444445 | 0 |
| 0.8701388888888889 | 0 |
| 0.8708333333333332 | 0 |
| 0.8715277777777778 | 0 |
| 0.8722222222222222 | 0 |
| 0.8729166666666667 | 0 |
| 0.873611111111111 | 0 |
| 0.8743055555555556 | 0 |
| 0.875 | 0 |
| 0.8756944444444444 | 0 |
| 0.876388888888889 | 0 |
| 0.8770833333333333 | 0 |
| 0.8777777777777778 | 0 |
| 0.8784722222222222 | 0 |
| 0.8791666666666668 | 0 |
| 0.8798611111111111 | 0 |
| 0.8805555555555555 | 0 |
| 0.88125 | 0 |
| 0.8819444444444445 | 0 |
| 0.8826388888888889 | 0 |
| 0.8833333333333333 | 0 |
| 0.8840277777777777 | 0 |
| 0.8847222222222223 | 0 |
| 0.8854166666666666 | 0 |
| 0.8861111111111111 | 0 |
| 0.8868055555555556 | 0 |
| 0.8875000000000001 | 0 |
| 0.8881944444444444 | 0 |
| 0.8888888888888888 | 0 |
| 0.8895833333333334 | 0 |
| 0.8902777777777778 | 0 |
| 0.8909722222222222 | 0 |
| 0.8916666666666666 | 0 |
| 0.8923611111111112 | 0 |
| 0.8930555555555556 | 0 |
| 0.8937499999999999 | 0 |
| 0.8944444444444444 | 0 |
| 0.8951388888888889 | 0 |
| 0.8958333333333334 | 0 |
| 0.8965277777777777 | 0 |
| 0.8972222222222223 | 0 |
| 0.8979166666666667 | 0 |
| 0.8986111111111111 | 0 |
| 0.8993055555555555 | 0 |
| 0.9 | 0 |
| 0.9006944444444445 | 0 |
| 0.9013888888888889 | 0 |
| 0.9020833333333332 | 0 |
| 0.9027777777777778 | 0 |
| 0.9034722222222222 | 0 |
| 0.9041666666666667 | 0 |
| 0.904861111111111 | 0 |
| 0.9055555555555556 | 0 |
| 0.90625 | 0 |
| 0.9069444444444444 | 0 |
| 0.907638888888889 | 0 |
| 0.9083333333333333 | 0 |
| 0.9090277777777778 | 0 |
| 0.9097222222222222 | 0 |
| 0.9104166666666668 | 0 |
| 0.9111111111111111 | 0 |
| 0.9118055555555555 | 0 |
| 0.9125 | 0 |
| 0.9131944444444445 | 0 |
| 0.9138888888888889 | 0 |
| 0.9145833333333333 | 0 |
| 0.9152777777777777 | 0 |
| 0.9159722222222223 | 0 |
| 0.9166666666666666 | 0 |
| 0.9173611111111111 | 0 |
| 0.9180555555555556 | 0 |
| 0.9187500000000001 | 0 |
| 0.9194444444444444 | 0 |
| 0.9201388888888888 | 0 |
| 0.9208333333333334 | 0 |
| 0.9215277777777778 | 0 |
| 0.9222222222222222 | 0 |
| 0.9229166666666666 | 0 |
| 0.9236111111111112 | 0 |
| 0.9243055555555556 | 0 |
| 0.9249999999999999 | 0 |
| 0.9256944444444444 | 0 |
| 0.9263888888888889 | 0 |
| 0.9270833333333334 | 0 |
| 0.9277777777777777 | 0 |
| 0.9284722222222223 | 0 |
| 0.9291666666666667 | 0 |
| 0.9298611111111111 | 0 |
| 0.9305555555555555 | 0 |
| 0.93125 | 0 |
| 0.9319444444444445 | 0 |
| 0.9326388888888889 | 0 |
| 0.9333333333333332 | 0 |
| 0.9340277777777778 | 0 |
| 0.9347222222222222 | 0 |
| 0.9354166666666667 | 0 |
| 0.936111111111111 | 0 |
| 0.9368055555555556 | 0 |
| 0.9375 | 0 |
| 0.9381944444444444 | 0 |
| 0.938888888888889 | 0 |
| 0.9395833333333333 | 0 |
| 0.9402777777777778 | 0 |
| 0.9409722222222222 | 0 |
| 0.9416666666666668 | 0 |
| 0.9423611111111111 | 0 |
| 0.9430555555555555 | 0 |
| 0.94375 | 0 |
| 0.9444444444444445 | 0 |
| 0.9451388888888889 | 0 |
| 0.9458333333333333 | 0 |
| 0.9465277777777777 | 0 |
| 0.9472222222222223 | 0 |
| 0.9479166666666666 | 0 |
| 0.9486111111111111 | 0 |
| 0.9493055555555556 | 0 |
| 0.9500000000000001 | 0 |
| 0.9506944444444444 | 0 |
| 0.9513888888888888 | 0 |
| 0.9520833333333334 | 0 |
| 0.9527777777777778 | 0 |
| 0.9534722222222222 | 0 |
| 0.9541666666666666 | 0 |
| 0.9548611111111112 | 0 |
| 0.9555555555555556 | 0 |
| 0.9562499999999999 | 0 |
| 0.9569444444444444 | 0 |
| 0.9576388888888889 | 0 |
| 0.9583333333333334 | 0 |
| 0.9590277777777777 | 0 |
| 0.9597222222222223 | 0 |
| 0.9604166666666667 | 0 |
| 0.9611111111111111 | 0 |
| 0.9618055555555555 | 0 |
| 0.9625 | 0 |
| 0.9631944444444445 | 0 |
| 0.9638888888888889 | 0 |
| 0.9645833333333332 | 0 |
| 0.9652777777777778 | 0 |
| 0.9659722222222222 | 0 |
| 0.9666666666666667 | 0 |
| 0.967361111111111 | 0 |
| 0.9680555555555556 | 0 |
| 0.96875 | 0 |
| 0.9694444444444444 | 0 |
| 0.970138888888889 | 0 |
| 0.9708333333333333 | 0 |
| 0.9715277777777778 | 0 |
| 0.9722222222222222 | 0 |
| 0.9729166666666668 | 0 |
| 0.9736111111111111 | 0 |
| 0.9743055555555555 | 0 |
| 0.975 | 0 |
| 0.9756944444444445 | 0 |
| 0.9763888888888889 | 0 |
| 0.9770833333333333 | 0 |
| 0.9777777777777777 | 0 |
| 0.9784722222222223 | 0 |
| 0.9791666666666666 | 0 |
| 0.9798611111111111 | 0 |
| 0.9805555555555556 | 0 |
| 0.9812500000000001 | 0 |
| 0.9819444444444444 | 0 |
| 0.9826388888888888 | 0 |
| 0.9833333333333334 | 0 |
| 0.9840277777777778 | 0 |
| 0.9847222222222222 | 0 |
| 0.9854166666666666 | 0 |
| 0.9861111111111112 | 0 |
| 0.9868055555555556 | 0 |
| 0.9874999999999999 | 0 |
| 0.9881944444444444 | 0 |
| 0.9888888888888889 | 0 |
| 0.9895833333333334 | 0 |
| 0.9902777777777777 | 0 |
| 0.9909722222222223 | 0 |
| 0.9916666666666667 | 0 |
| 0.9923611111111111 | 0 |
| 0.9930555555555555 | 0 |
| 0.99375 | 0 |
| 0.9944444444444445 | 0 |
| 0.9951388888888889 | 0 |
| 0.9958333333333332 | 0 |
| 0.9965277777777778 | 0 |
| 0.9972222222222222 | 0 |
| 0.9979166666666667 | 0 |
| 0.998611111111111 | 0 |
| 0.9993055555555556 | 0 |